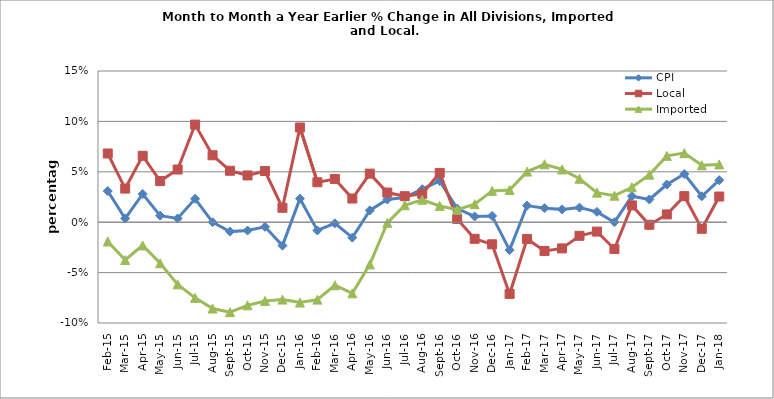
| Category | CPI | Local | Imported |
|---|---|---|---|
| 2015-02-02 | 0.031 | 0.068 | -0.019 |
| 2015-03-02 | 0.004 | 0.033 | -0.037 |
| 2015-04-02 | 0.028 | 0.066 | -0.023 |
| 2015-05-01 | 0.007 | 0.041 | -0.041 |
| 2015-06-01 | 0.004 | 0.052 | -0.062 |
| 2015-07-01 | 0.023 | 0.097 | -0.075 |
| 2015-08-01 | 0 | 0.066 | -0.086 |
| 2015-09-01 | -0.009 | 0.051 | -0.089 |
| 2015-10-01 | -0.008 | 0.046 | -0.082 |
| 2015-11-01 | -0.005 | 0.051 | -0.078 |
| 2015-12-01 | -0.023 | 0.014 | -0.077 |
| 2016-01-01 | 0.023 | 0.094 | -0.08 |
| 2016-02-01 | -0.008 | 0.04 | -0.077 |
| 2016-03-01 | -0.001 | 0.043 | -0.063 |
| 2016-04-01 | -0.015 | 0.023 | -0.071 |
| 2016-05-01 | 0.012 | 0.048 | -0.042 |
| 2016-06-01 | 0.023 | 0.029 | -0.001 |
| 2016-07-01 | 0.025 | 0.026 | 0.017 |
| 2016-08-01 | 0.033 | 0.028 | 0.022 |
| 2016-09-01 | 0.041 | 0.049 | 0.016 |
| 2016-10-01 | 0.014 | 0.003 | 0.012 |
| 2016-11-01 | 0.006 | -0.016 | 0.018 |
| 2016-12-01 | 0.006 | -0.022 | 0.031 |
| 2017-01-01 | -0.028 | -0.071 | 0.032 |
| 2017-02-01 | 0.016 | -0.017 | 0.05 |
| 2017-03-01 | 0.014 | -0.029 | 0.057 |
| 2017-04-01 | 0.013 | -0.026 | 0.052 |
| 2017-05-01 | 0.015 | -0.013 | 0.043 |
| 2017-06-01 | 0.01 | -0.009 | 0.029 |
| 2017-07-01 | 0 | -0.027 | 0.026 |
| 2017-08-01 | 0.026 | 0.017 | 0.035 |
| 2017-09-01 | 0.023 | -0.003 | 0.047 |
| 2017-10-01 | 0.037 | 0.008 | 0.066 |
| 2017-11-01 | 0.048 | 0.026 | 0.069 |
| 2017-12-01 | 0.026 | -0.007 | 0.056 |
| 2018-01-01 | 0.042 | 0.025 | 0.057 |